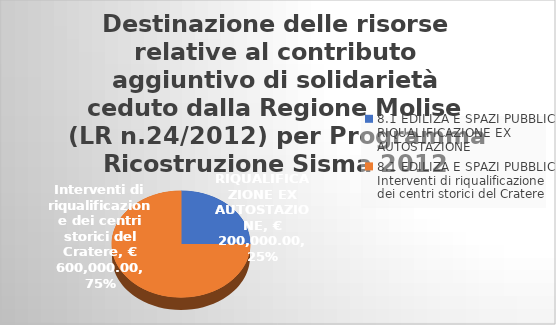
| Category | Series 0 |
|---|---|
| 0 | 200000 |
| 1 | 600000 |